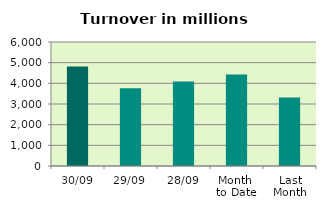
| Category | Series 0 |
|---|---|
| 30/09 | 4810.973 |
| 29/09 | 3761.114 |
| 28/09 | 4091.469 |
| Month 
to Date | 4425.778 |
| Last
Month | 3319.434 |